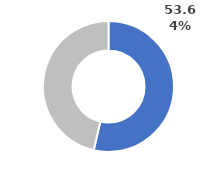
| Category | Series 0 |
|---|---|
| 0 | 0.536 |
| 1 | 0.464 |